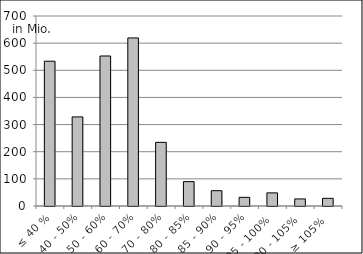
| Category | Volumen |
|---|---|
| ≤ 40 % | 533438821.424 |
| 40 - 50% | 328276539.328 |
| 50 - 60% | 552657662.184 |
| 60 - 70% | 619225675.294 |
| 70 - 80% | 234521099.788 |
| 80 - 85% | 89720975.641 |
| 85 - 90% | 56338358.864 |
| 90 - 95% | 31893290.008 |
| 95 - 100% | 48309434.921 |
| 100 - 105% | 26047954.05 |
| ≥ 105% | 28192998.42 |